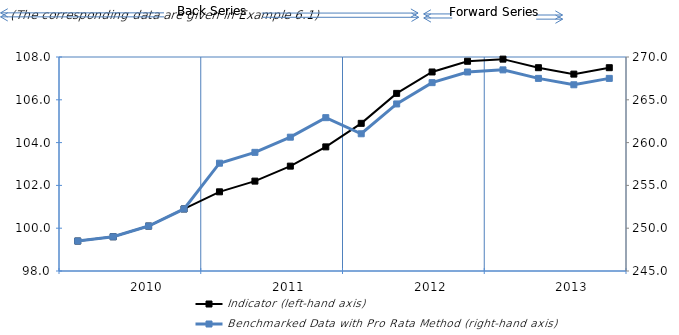
| Category | Indicator (left-hand axis) |
|---|---|
| nan | 99.4 |
| nan | 99.6 |
| 2010.0 | 100.1 |
| nan | 100.9 |
| nan | 101.7 |
| nan | 102.2 |
| 2011.0 | 102.9 |
| nan | 103.8 |
| nan | 104.9 |
| nan | 106.3 |
| 2012.0 | 107.3 |
| nan | 107.8 |
| nan | 107.9 |
| nan | 107.5 |
| 2013.0 | 107.2 |
| nan | 107.5 |